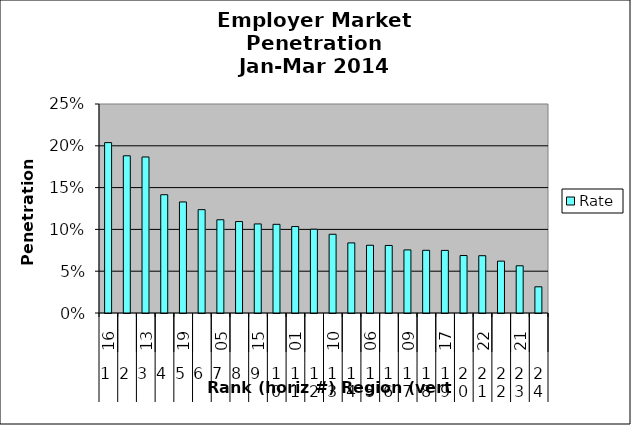
| Category | Rate |
|---|---|
| 0 | 0.204 |
| 1 | 0.188 |
| 2 | 0.187 |
| 3 | 0.141 |
| 4 | 0.133 |
| 5 | 0.124 |
| 6 | 0.112 |
| 7 | 0.109 |
| 8 | 0.107 |
| 9 | 0.106 |
| 10 | 0.103 |
| 11 | 0.1 |
| 12 | 0.094 |
| 13 | 0.084 |
| 14 | 0.081 |
| 15 | 0.081 |
| 16 | 0.075 |
| 17 | 0.075 |
| 18 | 0.075 |
| 19 | 0.069 |
| 20 | 0.069 |
| 21 | 0.062 |
| 22 | 0.056 |
| 23 | 0.031 |